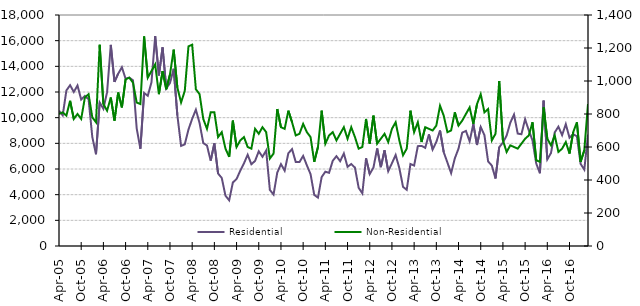
| Category | Residential |
|---|---|
| 2005-04-01 | 10540 |
| 2005-05-01 | 10180 |
| 2005-06-01 | 12120 |
| 2005-07-01 | 12530 |
| 2005-08-01 | 12000 |
| 2005-09-01 | 12510 |
| 2005-10-01 | 11410 |
| 2005-11-01 | 11690 |
| 2005-12-01 | 11430 |
| 2006-01-01 | 8500 |
| 2006-02-01 | 7150 |
| 2006-03-01 | 11180 |
| 2006-04-01 | 10690 |
| 2006-05-01 | 11990 |
| 2006-06-01 | 15670 |
| 2006-07-01 | 12790 |
| 2006-08-01 | 13430 |
| 2006-09-01 | 13930 |
| 2006-10-01 | 13030 |
| 2006-11-01 | 13120 |
| 2006-12-01 | 12920 |
| 2007-01-01 | 9170 |
| 2007-02-01 | 7580 |
| 2007-03-01 | 11920 |
| 2007-04-01 | 11700 |
| 2007-05-01 | 12750 |
| 2007-06-01 | 16360 |
| 2007-07-01 | 13290 |
| 2007-08-01 | 15480 |
| 2007-09-01 | 12270 |
| 2007-10-01 | 12700 |
| 2007-11-01 | 13810 |
| 2007-12-01 | 10180 |
| 2008-01-01 | 7800 |
| 2008-02-01 | 7920 |
| 2008-03-01 | 9080 |
| 2008-04-01 | 9910 |
| 2008-05-01 | 10620 |
| 2008-06-01 | 9580 |
| 2008-07-01 | 8020 |
| 2008-08-01 | 7830 |
| 2008-09-01 | 6650 |
| 2008-10-01 | 8000 |
| 2008-11-01 | 5650 |
| 2008-12-01 | 5300 |
| 2009-01-01 | 3920 |
| 2009-02-01 | 3560 |
| 2009-03-01 | 4950 |
| 2009-04-01 | 5220 |
| 2009-05-01 | 5870 |
| 2009-06-01 | 6440 |
| 2009-07-01 | 7110 |
| 2009-08-01 | 6370 |
| 2009-09-01 | 6630 |
| 2009-10-01 | 7380 |
| 2009-11-01 | 6950 |
| 2009-12-01 | 7440 |
| 2010-01-01 | 4370 |
| 2010-02-01 | 4010 |
| 2010-03-01 | 5720 |
| 2010-04-01 | 6380 |
| 2010-05-01 | 5870 |
| 2010-06-01 | 7230 |
| 2010-07-01 | 7550 |
| 2010-08-01 | 6540 |
| 2010-09-01 | 6540 |
| 2010-10-01 | 7020 |
| 2010-11-01 | 6290 |
| 2010-12-01 | 5600 |
| 2011-01-01 | 3980 |
| 2011-02-01 | 3770 |
| 2011-03-01 | 5370 |
| 2011-04-01 | 5790 |
| 2011-05-01 | 5700 |
| 2011-06-01 | 6640 |
| 2011-07-01 | 7000 |
| 2011-08-01 | 6610 |
| 2011-09-01 | 7210 |
| 2011-10-01 | 6170 |
| 2011-11-01 | 6390 |
| 2011-12-01 | 6110 |
| 2012-01-01 | 4540 |
| 2012-02-01 | 4100 |
| 2012-03-01 | 6830 |
| 2012-04-01 | 5610 |
| 2012-05-01 | 6110 |
| 2012-06-01 | 7600 |
| 2012-07-01 | 6140 |
| 2012-08-01 | 7460 |
| 2012-09-01 | 5830 |
| 2012-10-01 | 6450 |
| 2012-11-01 | 7090 |
| 2012-12-01 | 6070 |
| 2013-01-01 | 4610 |
| 2013-02-01 | 4380 |
| 2013-03-01 | 6390 |
| 2013-04-01 | 6270 |
| 2013-05-01 | 7780 |
| 2013-06-01 | 7800 |
| 2013-07-01 | 7650 |
| 2013-08-01 | 8700 |
| 2013-09-01 | 7520 |
| 2013-10-01 | 8110 |
| 2013-11-01 | 9000 |
| 2013-12-01 | 7310 |
| 2014-01-01 | 6500 |
| 2014-02-01 | 5680 |
| 2014-03-01 | 6830 |
| 2014-04-01 | 7590 |
| 2014-05-01 | 8830 |
| 2014-06-01 | 8970 |
| 2014-07-01 | 8160 |
| 2014-08-01 | 9500 |
| 2014-09-01 | 7870 |
| 2014-10-01 | 9270 |
| 2014-11-01 | 8640 |
| 2014-12-01 | 6590 |
| 2015-01-01 | 6270 |
| 2015-02-01 | 5260 |
| 2015-03-01 | 7700 |
| 2015-04-01 | 8060 |
| 2015-05-01 | 8600 |
| 2015-06-01 | 9610 |
| 2015-07-01 | 10240 |
| 2015-08-01 | 8760 |
| 2015-09-01 | 8710 |
| 2015-10-01 | 9880 |
| 2015-11-01 | 9000 |
| 2015-12-01 | 8230 |
| 2016-01-01 | 6430 |
| 2016-02-01 | 5670 |
| 2016-03-01 | 11330 |
| 2016-04-01 | 6750 |
| 2016-05-01 | 7250 |
| 2016-06-01 | 8850 |
| 2016-07-01 | 9300 |
| 2016-08-01 | 8640 |
| 2016-09-01 | 9490 |
| 2016-10-01 | 8440 |
| 2016-11-01 | 8710 |
| 2016-12-01 | 8550 |
| 2017-01-01 | 6400 |
| 2017-02-01 | 5950 |
| 2017-03-01 | 8690 |